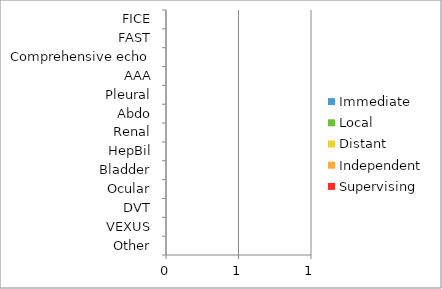
| Category | Immediate | Local | Distant | Independent | Supervising |
|---|---|---|---|---|---|
| FICE | 0 | 0 | 0 | 0 | 0 |
| FAST | 0 | 0 | 0 | 0 | 0 |
| Comprehensive echo | 0 | 0 | 0 | 0 | 0 |
| AAA | 0 | 0 | 0 | 0 | 0 |
| Pleural | 0 | 0 | 0 | 0 | 0 |
| Abdo | 0 | 0 | 0 | 0 | 0 |
| Renal | 0 | 0 | 0 | 0 | 0 |
| HepBil | 0 | 0 | 0 | 0 | 0 |
| Bladder | 0 | 0 | 0 | 0 | 0 |
| Ocular | 0 | 0 | 0 | 0 | 0 |
| DVT | 0 | 0 | 0 | 0 | 0 |
| VEXUS | 0 | 0 | 0 | 0 | 0 |
| Other | 0 | 0 | 0 | 0 | 0 |